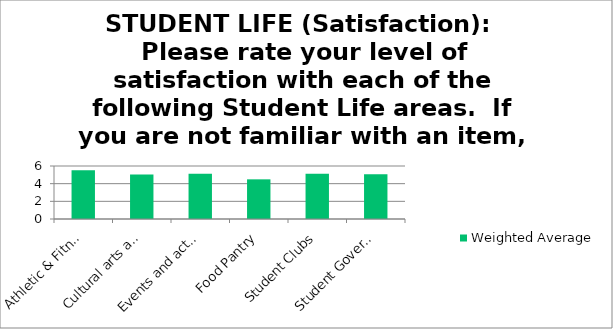
| Category | Weighted Average |
|---|---|
| Athletic & Fitness Center ( if available) | 5.51 |
| Cultural arts activities (art galleries, plays, concerts, etc.) | 5.05 |
| Events and activities for students (speakers, movies, trips, etc.) | 5.12 |
| Food Pantry | 4.49 |
| Student Clubs | 5.12 |
| Student Government | 5.07 |